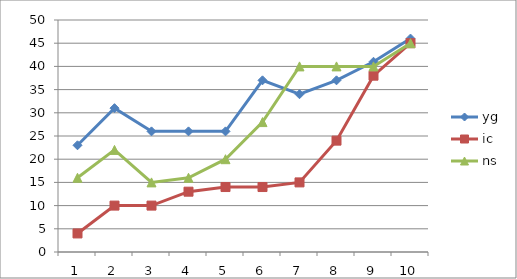
| Category | yg | ic | ns |
|---|---|---|---|
| 0 | 23 | 4 | 16 |
| 1 | 31 | 10 | 22 |
| 2 | 26 | 10 | 15 |
| 3 | 26 | 13 | 16 |
| 4 | 26 | 14 | 20 |
| 5 | 37 | 14 | 28 |
| 6 | 34 | 15 | 40 |
| 7 | 37 | 24 | 40 |
| 8 | 41 | 38 | 40 |
| 9 | 46 | 45 | 45 |